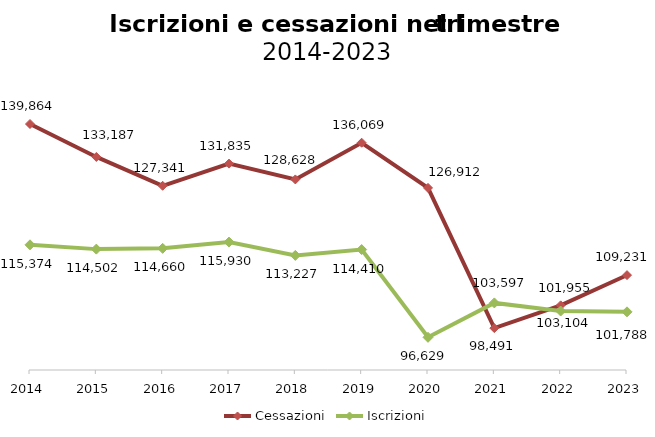
| Category | Cessazioni | Iscrizioni |
|---|---|---|
| 2014.0 | 139864 | 115374 |
| 2015.0 | 133187 | 114502 |
| 2016.0 | 127341 | 114660 |
| 2017.0 | 131835 | 115930 |
| 2018.0 | 128628 | 113227 |
| 2019.0 | 136069 | 114410 |
| 2020.0 | 126912 | 96629 |
| 2021.0 | 98491 | 103597 |
| 2022.0 | 103104 | 101955 |
| 2023.0 | 109231 | 101788 |